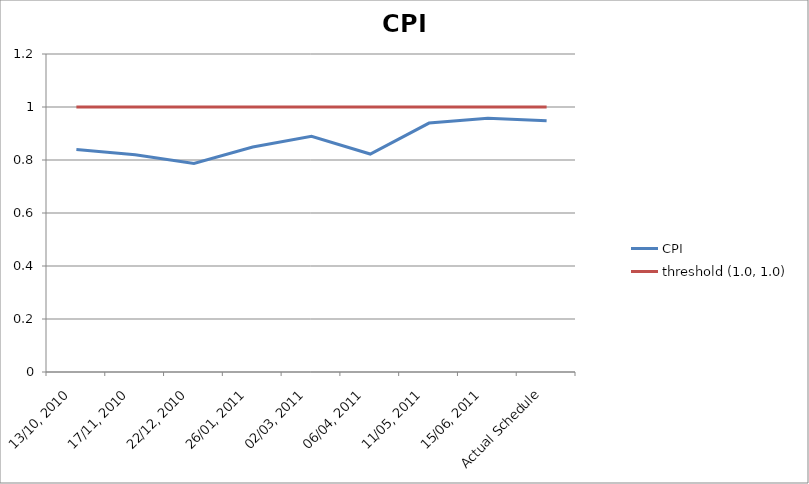
| Category | CPI | threshold (1.0, 1.0) |
|---|---|---|
| 13/10, 2010 | 0.84 | 1 |
| 17/11, 2010 | 0.82 | 1 |
| 22/12, 2010 | 0.787 | 1 |
| 26/01, 2011 | 0.849 | 1 |
| 02/03, 2011 | 0.889 | 1 |
| 06/04, 2011 | 0.823 | 1 |
| 11/05, 2011 | 0.939 | 1 |
| 15/06, 2011 | 0.958 | 1 |
| Actual Schedule | 0.948 | 1 |